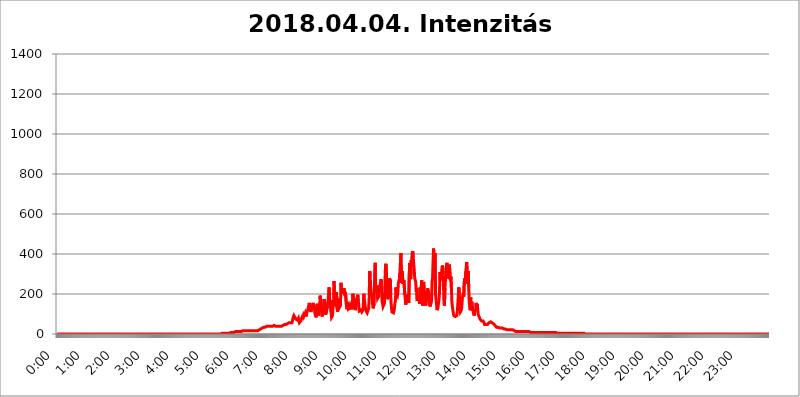
| Category | 2018.04.04. Intenzitás [W/m^2] |
|---|---|
| 0.0 | 0 |
| 0.0006944444444444445 | 0 |
| 0.001388888888888889 | 0 |
| 0.0020833333333333333 | 0 |
| 0.002777777777777778 | 0 |
| 0.003472222222222222 | 0 |
| 0.004166666666666667 | 0 |
| 0.004861111111111111 | 0 |
| 0.005555555555555556 | 0 |
| 0.0062499999999999995 | 0 |
| 0.006944444444444444 | 0 |
| 0.007638888888888889 | 0 |
| 0.008333333333333333 | 0 |
| 0.009027777777777779 | 0 |
| 0.009722222222222222 | 0 |
| 0.010416666666666666 | 0 |
| 0.011111111111111112 | 0 |
| 0.011805555555555555 | 0 |
| 0.012499999999999999 | 0 |
| 0.013194444444444444 | 0 |
| 0.013888888888888888 | 0 |
| 0.014583333333333332 | 0 |
| 0.015277777777777777 | 0 |
| 0.015972222222222224 | 0 |
| 0.016666666666666666 | 0 |
| 0.017361111111111112 | 0 |
| 0.018055555555555557 | 0 |
| 0.01875 | 0 |
| 0.019444444444444445 | 0 |
| 0.02013888888888889 | 0 |
| 0.020833333333333332 | 0 |
| 0.02152777777777778 | 0 |
| 0.022222222222222223 | 0 |
| 0.02291666666666667 | 0 |
| 0.02361111111111111 | 0 |
| 0.024305555555555556 | 0 |
| 0.024999999999999998 | 0 |
| 0.025694444444444447 | 0 |
| 0.02638888888888889 | 0 |
| 0.027083333333333334 | 0 |
| 0.027777777777777776 | 0 |
| 0.02847222222222222 | 0 |
| 0.029166666666666664 | 0 |
| 0.029861111111111113 | 0 |
| 0.030555555555555555 | 0 |
| 0.03125 | 0 |
| 0.03194444444444445 | 0 |
| 0.03263888888888889 | 0 |
| 0.03333333333333333 | 0 |
| 0.034027777777777775 | 0 |
| 0.034722222222222224 | 0 |
| 0.035416666666666666 | 0 |
| 0.036111111111111115 | 0 |
| 0.03680555555555556 | 0 |
| 0.0375 | 0 |
| 0.03819444444444444 | 0 |
| 0.03888888888888889 | 0 |
| 0.03958333333333333 | 0 |
| 0.04027777777777778 | 0 |
| 0.04097222222222222 | 0 |
| 0.041666666666666664 | 0 |
| 0.042361111111111106 | 0 |
| 0.04305555555555556 | 0 |
| 0.043750000000000004 | 0 |
| 0.044444444444444446 | 0 |
| 0.04513888888888889 | 0 |
| 0.04583333333333334 | 0 |
| 0.04652777777777778 | 0 |
| 0.04722222222222222 | 0 |
| 0.04791666666666666 | 0 |
| 0.04861111111111111 | 0 |
| 0.049305555555555554 | 0 |
| 0.049999999999999996 | 0 |
| 0.05069444444444445 | 0 |
| 0.051388888888888894 | 0 |
| 0.052083333333333336 | 0 |
| 0.05277777777777778 | 0 |
| 0.05347222222222222 | 0 |
| 0.05416666666666667 | 0 |
| 0.05486111111111111 | 0 |
| 0.05555555555555555 | 0 |
| 0.05625 | 0 |
| 0.05694444444444444 | 0 |
| 0.057638888888888885 | 0 |
| 0.05833333333333333 | 0 |
| 0.05902777777777778 | 0 |
| 0.059722222222222225 | 0 |
| 0.06041666666666667 | 0 |
| 0.061111111111111116 | 0 |
| 0.06180555555555556 | 0 |
| 0.0625 | 0 |
| 0.06319444444444444 | 0 |
| 0.06388888888888888 | 0 |
| 0.06458333333333334 | 0 |
| 0.06527777777777778 | 0 |
| 0.06597222222222222 | 0 |
| 0.06666666666666667 | 0 |
| 0.06736111111111111 | 0 |
| 0.06805555555555555 | 0 |
| 0.06874999999999999 | 0 |
| 0.06944444444444443 | 0 |
| 0.07013888888888889 | 0 |
| 0.07083333333333333 | 0 |
| 0.07152777777777779 | 0 |
| 0.07222222222222223 | 0 |
| 0.07291666666666667 | 0 |
| 0.07361111111111111 | 0 |
| 0.07430555555555556 | 0 |
| 0.075 | 0 |
| 0.07569444444444444 | 0 |
| 0.0763888888888889 | 0 |
| 0.07708333333333334 | 0 |
| 0.07777777777777778 | 0 |
| 0.07847222222222222 | 0 |
| 0.07916666666666666 | 0 |
| 0.0798611111111111 | 0 |
| 0.08055555555555556 | 0 |
| 0.08125 | 0 |
| 0.08194444444444444 | 0 |
| 0.08263888888888889 | 0 |
| 0.08333333333333333 | 0 |
| 0.08402777777777777 | 0 |
| 0.08472222222222221 | 0 |
| 0.08541666666666665 | 0 |
| 0.08611111111111112 | 0 |
| 0.08680555555555557 | 0 |
| 0.08750000000000001 | 0 |
| 0.08819444444444445 | 0 |
| 0.08888888888888889 | 0 |
| 0.08958333333333333 | 0 |
| 0.09027777777777778 | 0 |
| 0.09097222222222222 | 0 |
| 0.09166666666666667 | 0 |
| 0.09236111111111112 | 0 |
| 0.09305555555555556 | 0 |
| 0.09375 | 0 |
| 0.09444444444444444 | 0 |
| 0.09513888888888888 | 0 |
| 0.09583333333333333 | 0 |
| 0.09652777777777777 | 0 |
| 0.09722222222222222 | 0 |
| 0.09791666666666667 | 0 |
| 0.09861111111111111 | 0 |
| 0.09930555555555555 | 0 |
| 0.09999999999999999 | 0 |
| 0.10069444444444443 | 0 |
| 0.1013888888888889 | 0 |
| 0.10208333333333335 | 0 |
| 0.10277777777777779 | 0 |
| 0.10347222222222223 | 0 |
| 0.10416666666666667 | 0 |
| 0.10486111111111111 | 0 |
| 0.10555555555555556 | 0 |
| 0.10625 | 0 |
| 0.10694444444444444 | 0 |
| 0.1076388888888889 | 0 |
| 0.10833333333333334 | 0 |
| 0.10902777777777778 | 0 |
| 0.10972222222222222 | 0 |
| 0.1111111111111111 | 0 |
| 0.11180555555555556 | 0 |
| 0.11180555555555556 | 0 |
| 0.1125 | 0 |
| 0.11319444444444444 | 0 |
| 0.11388888888888889 | 0 |
| 0.11458333333333333 | 0 |
| 0.11527777777777777 | 0 |
| 0.11597222222222221 | 0 |
| 0.11666666666666665 | 0 |
| 0.1173611111111111 | 0 |
| 0.11805555555555557 | 0 |
| 0.11944444444444445 | 0 |
| 0.12013888888888889 | 0 |
| 0.12083333333333333 | 0 |
| 0.12152777777777778 | 0 |
| 0.12222222222222223 | 0 |
| 0.12291666666666667 | 0 |
| 0.12291666666666667 | 0 |
| 0.12361111111111112 | 0 |
| 0.12430555555555556 | 0 |
| 0.125 | 0 |
| 0.12569444444444444 | 0 |
| 0.12638888888888888 | 0 |
| 0.12708333333333333 | 0 |
| 0.16875 | 0 |
| 0.12847222222222224 | 0 |
| 0.12916666666666668 | 0 |
| 0.12986111111111112 | 0 |
| 0.13055555555555556 | 0 |
| 0.13125 | 0 |
| 0.13194444444444445 | 0 |
| 0.1326388888888889 | 0 |
| 0.13333333333333333 | 0 |
| 0.13402777777777777 | 0 |
| 0.13402777777777777 | 0 |
| 0.13472222222222222 | 0 |
| 0.13541666666666666 | 0 |
| 0.1361111111111111 | 0 |
| 0.13749999999999998 | 0 |
| 0.13819444444444443 | 0 |
| 0.1388888888888889 | 0 |
| 0.13958333333333334 | 0 |
| 0.14027777777777778 | 0 |
| 0.14097222222222222 | 0 |
| 0.14166666666666666 | 0 |
| 0.1423611111111111 | 0 |
| 0.14305555555555557 | 0 |
| 0.14375000000000002 | 0 |
| 0.14444444444444446 | 0 |
| 0.1451388888888889 | 0 |
| 0.1451388888888889 | 0 |
| 0.14652777777777778 | 0 |
| 0.14722222222222223 | 0 |
| 0.14791666666666667 | 0 |
| 0.1486111111111111 | 0 |
| 0.14930555555555555 | 0 |
| 0.15 | 0 |
| 0.15069444444444444 | 0 |
| 0.15138888888888888 | 0 |
| 0.15208333333333332 | 0 |
| 0.15277777777777776 | 0 |
| 0.15347222222222223 | 0 |
| 0.15416666666666667 | 0 |
| 0.15486111111111112 | 0 |
| 0.15555555555555556 | 0 |
| 0.15625 | 0 |
| 0.15694444444444444 | 0 |
| 0.15763888888888888 | 0 |
| 0.15833333333333333 | 0 |
| 0.15902777777777777 | 0 |
| 0.15972222222222224 | 0 |
| 0.16041666666666668 | 0 |
| 0.16111111111111112 | 0 |
| 0.16180555555555556 | 0 |
| 0.1625 | 0 |
| 0.16319444444444445 | 0 |
| 0.1638888888888889 | 0 |
| 0.16458333333333333 | 0 |
| 0.16527777777777777 | 0 |
| 0.16597222222222222 | 0 |
| 0.16666666666666666 | 0 |
| 0.1673611111111111 | 0 |
| 0.16805555555555554 | 0 |
| 0.16874999999999998 | 0 |
| 0.16944444444444443 | 0 |
| 0.17013888888888887 | 0 |
| 0.1708333333333333 | 0 |
| 0.17152777777777775 | 0 |
| 0.17222222222222225 | 0 |
| 0.1729166666666667 | 0 |
| 0.17361111111111113 | 0 |
| 0.17430555555555557 | 0 |
| 0.17500000000000002 | 0 |
| 0.17569444444444446 | 0 |
| 0.1763888888888889 | 0 |
| 0.17708333333333334 | 0 |
| 0.17777777777777778 | 0 |
| 0.17847222222222223 | 0 |
| 0.17916666666666667 | 0 |
| 0.1798611111111111 | 0 |
| 0.18055555555555555 | 0 |
| 0.18125 | 0 |
| 0.18194444444444444 | 0 |
| 0.1826388888888889 | 0 |
| 0.18333333333333335 | 0 |
| 0.1840277777777778 | 0 |
| 0.18472222222222223 | 0 |
| 0.18541666666666667 | 0 |
| 0.18611111111111112 | 0 |
| 0.18680555555555556 | 0 |
| 0.1875 | 0 |
| 0.18819444444444444 | 0 |
| 0.18888888888888888 | 0 |
| 0.18958333333333333 | 0 |
| 0.19027777777777777 | 0 |
| 0.1909722222222222 | 0 |
| 0.19166666666666665 | 0 |
| 0.19236111111111112 | 0 |
| 0.19305555555555554 | 0 |
| 0.19375 | 0 |
| 0.19444444444444445 | 0 |
| 0.1951388888888889 | 0 |
| 0.19583333333333333 | 0 |
| 0.19652777777777777 | 0 |
| 0.19722222222222222 | 0 |
| 0.19791666666666666 | 0 |
| 0.1986111111111111 | 0 |
| 0.19930555555555554 | 0 |
| 0.19999999999999998 | 0 |
| 0.20069444444444443 | 0 |
| 0.20138888888888887 | 0 |
| 0.2020833333333333 | 0 |
| 0.2027777777777778 | 0 |
| 0.2034722222222222 | 0 |
| 0.2041666666666667 | 0 |
| 0.20486111111111113 | 0 |
| 0.20555555555555557 | 0 |
| 0.20625000000000002 | 0 |
| 0.20694444444444446 | 0 |
| 0.2076388888888889 | 0 |
| 0.20833333333333334 | 0 |
| 0.20902777777777778 | 0 |
| 0.20972222222222223 | 0 |
| 0.21041666666666667 | 0 |
| 0.2111111111111111 | 0 |
| 0.21180555555555555 | 0 |
| 0.2125 | 0 |
| 0.21319444444444444 | 0 |
| 0.2138888888888889 | 0 |
| 0.21458333333333335 | 0 |
| 0.2152777777777778 | 0 |
| 0.21597222222222223 | 0 |
| 0.21666666666666667 | 0 |
| 0.21736111111111112 | 0 |
| 0.21805555555555556 | 0 |
| 0.21875 | 0 |
| 0.21944444444444444 | 0 |
| 0.22013888888888888 | 0 |
| 0.22083333333333333 | 0 |
| 0.22152777777777777 | 0 |
| 0.2222222222222222 | 0 |
| 0.22291666666666665 | 0 |
| 0.2236111111111111 | 0 |
| 0.22430555555555556 | 0 |
| 0.225 | 0 |
| 0.22569444444444445 | 0 |
| 0.2263888888888889 | 0 |
| 0.22708333333333333 | 0 |
| 0.22777777777777777 | 0 |
| 0.22847222222222222 | 3.525 |
| 0.22916666666666666 | 0 |
| 0.2298611111111111 | 3.525 |
| 0.23055555555555554 | 3.525 |
| 0.23124999999999998 | 3.525 |
| 0.23194444444444443 | 3.525 |
| 0.23263888888888887 | 3.525 |
| 0.2333333333333333 | 3.525 |
| 0.2340277777777778 | 3.525 |
| 0.2347222222222222 | 3.525 |
| 0.2354166666666667 | 3.525 |
| 0.23611111111111113 | 3.525 |
| 0.23680555555555557 | 3.525 |
| 0.23750000000000002 | 3.525 |
| 0.23819444444444446 | 3.525 |
| 0.2388888888888889 | 3.525 |
| 0.23958333333333334 | 3.525 |
| 0.24027777777777778 | 3.525 |
| 0.24097222222222223 | 3.525 |
| 0.24166666666666667 | 3.525 |
| 0.2423611111111111 | 3.525 |
| 0.24305555555555555 | 3.525 |
| 0.24375 | 7.887 |
| 0.24444444444444446 | 7.887 |
| 0.24513888888888888 | 7.887 |
| 0.24583333333333335 | 7.887 |
| 0.2465277777777778 | 7.887 |
| 0.24722222222222223 | 7.887 |
| 0.24791666666666667 | 7.887 |
| 0.24861111111111112 | 7.887 |
| 0.24930555555555556 | 7.887 |
| 0.25 | 12.257 |
| 0.25069444444444444 | 12.257 |
| 0.2513888888888889 | 12.257 |
| 0.2520833333333333 | 12.257 |
| 0.25277777777777777 | 12.257 |
| 0.2534722222222222 | 12.257 |
| 0.25416666666666665 | 12.257 |
| 0.2548611111111111 | 12.257 |
| 0.2555555555555556 | 12.257 |
| 0.25625000000000003 | 12.257 |
| 0.2569444444444445 | 12.257 |
| 0.2576388888888889 | 12.257 |
| 0.25833333333333336 | 12.257 |
| 0.2590277777777778 | 16.636 |
| 0.25972222222222224 | 12.257 |
| 0.2604166666666667 | 16.636 |
| 0.2611111111111111 | 16.636 |
| 0.26180555555555557 | 16.636 |
| 0.2625 | 16.636 |
| 0.26319444444444445 | 16.636 |
| 0.2638888888888889 | 16.636 |
| 0.26458333333333334 | 16.636 |
| 0.2652777777777778 | 16.636 |
| 0.2659722222222222 | 16.636 |
| 0.26666666666666666 | 16.636 |
| 0.2673611111111111 | 16.636 |
| 0.26805555555555555 | 16.636 |
| 0.26875 | 16.636 |
| 0.26944444444444443 | 16.636 |
| 0.2701388888888889 | 16.636 |
| 0.2708333333333333 | 16.636 |
| 0.27152777777777776 | 16.636 |
| 0.2722222222222222 | 16.636 |
| 0.27291666666666664 | 16.636 |
| 0.2736111111111111 | 16.636 |
| 0.2743055555555555 | 16.636 |
| 0.27499999999999997 | 16.636 |
| 0.27569444444444446 | 16.636 |
| 0.27638888888888885 | 16.636 |
| 0.27708333333333335 | 16.636 |
| 0.2777777777777778 | 12.257 |
| 0.27847222222222223 | 16.636 |
| 0.2791666666666667 | 16.636 |
| 0.2798611111111111 | 16.636 |
| 0.28055555555555556 | 16.636 |
| 0.28125 | 16.636 |
| 0.28194444444444444 | 21.024 |
| 0.2826388888888889 | 21.024 |
| 0.2833333333333333 | 21.024 |
| 0.28402777777777777 | 21.024 |
| 0.2847222222222222 | 25.419 |
| 0.28541666666666665 | 25.419 |
| 0.28611111111111115 | 25.419 |
| 0.28680555555555554 | 25.419 |
| 0.28750000000000003 | 29.823 |
| 0.2881944444444445 | 29.823 |
| 0.2888888888888889 | 29.823 |
| 0.28958333333333336 | 34.234 |
| 0.2902777777777778 | 34.234 |
| 0.29097222222222224 | 34.234 |
| 0.2916666666666667 | 34.234 |
| 0.2923611111111111 | 34.234 |
| 0.29305555555555557 | 38.653 |
| 0.29375 | 38.653 |
| 0.29444444444444445 | 43.079 |
| 0.2951388888888889 | 38.653 |
| 0.29583333333333334 | 38.653 |
| 0.2965277777777778 | 38.653 |
| 0.2972222222222222 | 38.653 |
| 0.29791666666666666 | 38.653 |
| 0.2986111111111111 | 38.653 |
| 0.29930555555555555 | 38.653 |
| 0.3 | 38.653 |
| 0.30069444444444443 | 38.653 |
| 0.3013888888888889 | 38.653 |
| 0.3020833333333333 | 38.653 |
| 0.30277777777777776 | 43.079 |
| 0.3034722222222222 | 43.079 |
| 0.30416666666666664 | 43.079 |
| 0.3048611111111111 | 43.079 |
| 0.3055555555555555 | 43.079 |
| 0.30624999999999997 | 38.653 |
| 0.3069444444444444 | 38.653 |
| 0.3076388888888889 | 38.653 |
| 0.30833333333333335 | 38.653 |
| 0.3090277777777778 | 38.653 |
| 0.30972222222222223 | 38.653 |
| 0.3104166666666667 | 38.653 |
| 0.3111111111111111 | 38.653 |
| 0.31180555555555556 | 38.653 |
| 0.3125 | 38.653 |
| 0.31319444444444444 | 38.653 |
| 0.3138888888888889 | 38.653 |
| 0.3145833333333333 | 38.653 |
| 0.31527777777777777 | 38.653 |
| 0.3159722222222222 | 43.079 |
| 0.31666666666666665 | 43.079 |
| 0.31736111111111115 | 43.079 |
| 0.31805555555555554 | 47.511 |
| 0.31875000000000003 | 47.511 |
| 0.3194444444444445 | 47.511 |
| 0.3201388888888889 | 47.511 |
| 0.32083333333333336 | 47.511 |
| 0.3215277777777778 | 47.511 |
| 0.32222222222222224 | 51.951 |
| 0.3229166666666667 | 51.951 |
| 0.3236111111111111 | 51.951 |
| 0.32430555555555557 | 56.398 |
| 0.325 | 56.398 |
| 0.32569444444444445 | 51.951 |
| 0.3263888888888889 | 56.398 |
| 0.32708333333333334 | 56.398 |
| 0.3277777777777778 | 51.951 |
| 0.3284722222222222 | 51.951 |
| 0.32916666666666666 | 56.398 |
| 0.3298611111111111 | 65.31 |
| 0.33055555555555555 | 78.722 |
| 0.33125 | 83.205 |
| 0.33194444444444443 | 92.184 |
| 0.3326388888888889 | 87.692 |
| 0.3333333333333333 | 83.205 |
| 0.3340277777777778 | 83.205 |
| 0.3347222222222222 | 74.246 |
| 0.3354166666666667 | 69.775 |
| 0.3361111111111111 | 69.775 |
| 0.3368055555555556 | 69.775 |
| 0.33749999999999997 | 74.246 |
| 0.33819444444444446 | 78.722 |
| 0.33888888888888885 | 65.31 |
| 0.33958333333333335 | 56.398 |
| 0.34027777777777773 | 56.398 |
| 0.34097222222222223 | 60.85 |
| 0.3416666666666666 | 65.31 |
| 0.3423611111111111 | 74.246 |
| 0.3430555555555555 | 78.722 |
| 0.34375 | 87.692 |
| 0.3444444444444445 | 87.692 |
| 0.3451388888888889 | 96.682 |
| 0.3458333333333334 | 87.692 |
| 0.34652777777777777 | 87.692 |
| 0.34722222222222227 | 87.692 |
| 0.34791666666666665 | 105.69 |
| 0.34861111111111115 | 96.682 |
| 0.34930555555555554 | 87.692 |
| 0.35000000000000003 | 110.201 |
| 0.3506944444444444 | 105.69 |
| 0.3513888888888889 | 119.235 |
| 0.3520833333333333 | 123.758 |
| 0.3527777777777778 | 123.758 |
| 0.3534722222222222 | 155.509 |
| 0.3541666666666667 | 160.056 |
| 0.3548611111111111 | 150.964 |
| 0.35555555555555557 | 110.201 |
| 0.35625 | 119.235 |
| 0.35694444444444445 | 141.884 |
| 0.3576388888888889 | 128.284 |
| 0.35833333333333334 | 132.814 |
| 0.3590277777777778 | 155.509 |
| 0.3597222222222222 | 119.235 |
| 0.36041666666666666 | 119.235 |
| 0.3611111111111111 | 137.347 |
| 0.36180555555555555 | 96.682 |
| 0.3625 | 92.184 |
| 0.36319444444444443 | 83.205 |
| 0.3638888888888889 | 87.692 |
| 0.3645833333333333 | 150.964 |
| 0.3652777777777778 | 114.716 |
| 0.3659722222222222 | 101.184 |
| 0.3666666666666667 | 92.184 |
| 0.3673611111111111 | 114.716 |
| 0.3680555555555556 | 137.347 |
| 0.36874999999999997 | 191.937 |
| 0.36944444444444446 | 150.964 |
| 0.37013888888888885 | 155.509 |
| 0.37083333333333335 | 110.201 |
| 0.37152777777777773 | 87.692 |
| 0.37222222222222223 | 110.201 |
| 0.3729166666666666 | 137.347 |
| 0.3736111111111111 | 123.758 |
| 0.3743055555555555 | 173.709 |
| 0.375 | 128.284 |
| 0.3756944444444445 | 128.284 |
| 0.3763888888888889 | 96.682 |
| 0.3770833333333334 | 101.184 |
| 0.37777777777777777 | 114.716 |
| 0.37847222222222227 | 128.284 |
| 0.37916666666666665 | 155.509 |
| 0.37986111111111115 | 169.156 |
| 0.38055555555555554 | 201.058 |
| 0.38125000000000003 | 233 |
| 0.3819444444444444 | 187.378 |
| 0.3826388888888889 | 128.284 |
| 0.3833333333333333 | 169.156 |
| 0.3840277777777778 | 110.201 |
| 0.3847222222222222 | 83.205 |
| 0.3854166666666667 | 83.205 |
| 0.3861111111111111 | 92.184 |
| 0.38680555555555557 | 137.347 |
| 0.3875 | 150.964 |
| 0.38819444444444445 | 264.932 |
| 0.3888888888888889 | 150.964 |
| 0.38958333333333334 | 173.709 |
| 0.3902777777777778 | 155.509 |
| 0.3909722222222222 | 137.347 |
| 0.39166666666666666 | 210.182 |
| 0.3923611111111111 | 128.284 |
| 0.39305555555555555 | 110.201 |
| 0.39375 | 132.814 |
| 0.39444444444444443 | 178.264 |
| 0.3951388888888889 | 173.709 |
| 0.3958333333333333 | 132.814 |
| 0.3965277777777778 | 132.814 |
| 0.3972222222222222 | 141.884 |
| 0.3979166666666667 | 255.813 |
| 0.3986111111111111 | 219.309 |
| 0.3993055555555556 | 210.182 |
| 0.39999999999999997 | 201.058 |
| 0.40069444444444446 | 228.436 |
| 0.40138888888888885 | 205.62 |
| 0.40208333333333335 | 228.436 |
| 0.40277777777777773 | 210.182 |
| 0.40347222222222223 | 191.937 |
| 0.4041666666666666 | 210.182 |
| 0.4048611111111111 | 214.746 |
| 0.4055555555555555 | 146.423 |
| 0.40625 | 123.758 |
| 0.4069444444444445 | 160.056 |
| 0.4076388888888889 | 150.964 |
| 0.4083333333333334 | 123.758 |
| 0.40902777777777777 | 123.758 |
| 0.40972222222222227 | 119.235 |
| 0.41041666666666665 | 128.284 |
| 0.41111111111111115 | 141.884 |
| 0.41180555555555554 | 146.423 |
| 0.41250000000000003 | 128.284 |
| 0.4131944444444444 | 146.423 |
| 0.4138888888888889 | 123.758 |
| 0.4145833333333333 | 201.058 |
| 0.4152777777777778 | 191.937 |
| 0.4159722222222222 | 146.423 |
| 0.4166666666666667 | 178.264 |
| 0.4173611111111111 | 132.814 |
| 0.41805555555555557 | 119.235 |
| 0.41875 | 128.284 |
| 0.41944444444444445 | 150.964 |
| 0.4201388888888889 | 141.884 |
| 0.42083333333333334 | 187.378 |
| 0.4215277777777778 | 196.497 |
| 0.4222222222222222 | 164.605 |
| 0.42291666666666666 | 141.884 |
| 0.4236111111111111 | 114.716 |
| 0.42430555555555555 | 110.201 |
| 0.425 | 119.235 |
| 0.42569444444444443 | 119.235 |
| 0.4263888888888889 | 114.716 |
| 0.4270833333333333 | 110.201 |
| 0.4277777777777778 | 110.201 |
| 0.4284722222222222 | 119.235 |
| 0.4291666666666667 | 137.347 |
| 0.4298611111111111 | 201.058 |
| 0.4305555555555556 | 182.82 |
| 0.43124999999999997 | 182.82 |
| 0.43194444444444446 | 137.347 |
| 0.43263888888888885 | 119.235 |
| 0.43333333333333335 | 114.716 |
| 0.43402777777777773 | 114.716 |
| 0.43472222222222223 | 105.69 |
| 0.4354166666666666 | 101.184 |
| 0.4361111111111111 | 105.69 |
| 0.4368055555555555 | 128.284 |
| 0.4375 | 182.82 |
| 0.4381944444444445 | 314.98 |
| 0.4388888888888889 | 292.259 |
| 0.4395833333333334 | 233 |
| 0.44027777777777777 | 233 |
| 0.44097222222222227 | 237.564 |
| 0.44166666666666665 | 173.709 |
| 0.44236111111111115 | 146.423 |
| 0.44305555555555554 | 128.284 |
| 0.44375000000000003 | 132.814 |
| 0.4444444444444444 | 150.964 |
| 0.4451388888888889 | 287.709 |
| 0.4458333333333333 | 355.712 |
| 0.4465277777777778 | 219.309 |
| 0.4472222222222222 | 237.564 |
| 0.4479166666666667 | 205.62 |
| 0.4486111111111111 | 242.127 |
| 0.44930555555555557 | 178.264 |
| 0.45 | 182.82 |
| 0.45069444444444445 | 187.378 |
| 0.4513888888888889 | 223.873 |
| 0.45208333333333334 | 233 |
| 0.4527777777777778 | 228.436 |
| 0.4534722222222222 | 255.813 |
| 0.45416666666666666 | 274.047 |
| 0.4548611111111111 | 214.746 |
| 0.45555555555555555 | 164.605 |
| 0.45625 | 150.964 |
| 0.45694444444444443 | 137.347 |
| 0.4576388888888889 | 132.814 |
| 0.4583333333333333 | 137.347 |
| 0.4590277777777778 | 155.509 |
| 0.4597222222222222 | 274.047 |
| 0.4604166666666667 | 342.162 |
| 0.4611111111111111 | 351.198 |
| 0.4618055555555556 | 287.709 |
| 0.46249999999999997 | 255.813 |
| 0.46319444444444446 | 191.937 |
| 0.46388888888888885 | 173.709 |
| 0.46458333333333335 | 178.264 |
| 0.46527777777777773 | 260.373 |
| 0.46597222222222223 | 278.603 |
| 0.4666666666666666 | 278.603 |
| 0.4673611111111111 | 264.932 |
| 0.4680555555555555 | 160.056 |
| 0.46875 | 132.814 |
| 0.4694444444444445 | 110.201 |
| 0.4701388888888889 | 105.69 |
| 0.4708333333333334 | 105.69 |
| 0.47152777777777777 | 105.69 |
| 0.47222222222222227 | 114.716 |
| 0.47291666666666665 | 128.284 |
| 0.47361111111111115 | 155.509 |
| 0.47430555555555554 | 164.605 |
| 0.47500000000000003 | 233 |
| 0.4756944444444444 | 201.058 |
| 0.4763888888888889 | 201.058 |
| 0.4770833333333333 | 191.937 |
| 0.4777777777777778 | 210.182 |
| 0.4784722222222222 | 255.813 |
| 0.4791666666666667 | 264.932 |
| 0.4798611111111111 | 255.813 |
| 0.48055555555555557 | 305.898 |
| 0.48125 | 301.354 |
| 0.48194444444444445 | 405.108 |
| 0.4826388888888889 | 292.259 |
| 0.48333333333333334 | 269.49 |
| 0.4840277777777778 | 314.98 |
| 0.4847222222222222 | 251.251 |
| 0.48541666666666666 | 251.251 |
| 0.4861111111111111 | 269.49 |
| 0.48680555555555555 | 269.49 |
| 0.4875 | 196.497 |
| 0.48819444444444443 | 173.709 |
| 0.4888888888888889 | 146.423 |
| 0.4895833333333333 | 196.497 |
| 0.4902777777777778 | 201.058 |
| 0.4909722222222222 | 169.156 |
| 0.4916666666666667 | 182.82 |
| 0.4923611111111111 | 164.605 |
| 0.4930555555555556 | 155.509 |
| 0.49374999999999997 | 305.898 |
| 0.49444444444444446 | 355.712 |
| 0.49513888888888885 | 301.354 |
| 0.49583333333333335 | 274.047 |
| 0.49652777777777773 | 369.23 |
| 0.49722222222222223 | 337.639 |
| 0.4979166666666666 | 405.108 |
| 0.4986111111111111 | 414.035 |
| 0.4993055555555555 | 382.715 |
| 0.5 | 378.224 |
| 0.5006944444444444 | 319.517 |
| 0.5013888888888889 | 278.603 |
| 0.5020833333333333 | 269.49 |
| 0.5027777777777778 | 260.373 |
| 0.5034722222222222 | 210.182 |
| 0.5041666666666667 | 228.436 |
| 0.5048611111111111 | 164.605 |
| 0.5055555555555555 | 173.709 |
| 0.50625 | 173.709 |
| 0.5069444444444444 | 191.937 |
| 0.5076388888888889 | 169.156 |
| 0.5083333333333333 | 150.964 |
| 0.5090277777777777 | 233 |
| 0.5097222222222222 | 214.746 |
| 0.5104166666666666 | 228.436 |
| 0.5111111111111112 | 269.49 |
| 0.5118055555555555 | 191.937 |
| 0.5125000000000001 | 141.884 |
| 0.5131944444444444 | 182.82 |
| 0.513888888888889 | 260.373 |
| 0.5145833333333333 | 223.873 |
| 0.5152777777777778 | 205.62 |
| 0.5159722222222222 | 150.964 |
| 0.5166666666666667 | 141.884 |
| 0.517361111111111 | 155.509 |
| 0.5180555555555556 | 169.156 |
| 0.5187499999999999 | 182.82 |
| 0.5194444444444445 | 228.436 |
| 0.5201388888888888 | 228.436 |
| 0.5208333333333334 | 205.62 |
| 0.5215277777777778 | 196.497 |
| 0.5222222222222223 | 146.423 |
| 0.5229166666666667 | 137.347 |
| 0.5236111111111111 | 132.814 |
| 0.5243055555555556 | 137.347 |
| 0.525 | 169.156 |
| 0.5256944444444445 | 260.373 |
| 0.5263888888888889 | 278.603 |
| 0.5270833333333333 | 364.728 |
| 0.5277777777777778 | 427.39 |
| 0.5284722222222222 | 387.202 |
| 0.5291666666666667 | 364.728 |
| 0.5298611111111111 | 405.108 |
| 0.5305555555555556 | 196.497 |
| 0.53125 | 173.709 |
| 0.5319444444444444 | 169.156 |
| 0.5326388888888889 | 119.235 |
| 0.5333333333333333 | 114.716 |
| 0.5340277777777778 | 132.814 |
| 0.5347222222222222 | 155.509 |
| 0.5354166666666667 | 169.156 |
| 0.5361111111111111 | 210.182 |
| 0.5368055555555555 | 310.44 |
| 0.5375 | 269.49 |
| 0.5381944444444444 | 269.49 |
| 0.5388888888888889 | 292.259 |
| 0.5395833333333333 | 333.113 |
| 0.5402777777777777 | 342.162 |
| 0.5409722222222222 | 310.44 |
| 0.5416666666666666 | 251.251 |
| 0.5423611111111112 | 155.509 |
| 0.5430555555555555 | 141.884 |
| 0.5437500000000001 | 228.436 |
| 0.5444444444444444 | 269.49 |
| 0.545138888888889 | 314.98 |
| 0.5458333333333333 | 342.162 |
| 0.5465277777777778 | 355.712 |
| 0.5472222222222222 | 278.603 |
| 0.5479166666666667 | 278.603 |
| 0.548611111111111 | 314.98 |
| 0.5493055555555556 | 278.603 |
| 0.5499999999999999 | 346.682 |
| 0.5506944444444445 | 342.162 |
| 0.5513888888888888 | 269.49 |
| 0.5520833333333334 | 287.709 |
| 0.5527777777777778 | 233 |
| 0.5534722222222223 | 164.605 |
| 0.5541666666666667 | 137.347 |
| 0.5548611111111111 | 119.235 |
| 0.5555555555555556 | 119.235 |
| 0.55625 | 92.184 |
| 0.5569444444444445 | 92.184 |
| 0.5576388888888889 | 87.692 |
| 0.5583333333333333 | 87.692 |
| 0.5590277777777778 | 83.205 |
| 0.5597222222222222 | 87.692 |
| 0.5604166666666667 | 92.184 |
| 0.5611111111111111 | 110.201 |
| 0.5618055555555556 | 150.964 |
| 0.5625 | 191.937 |
| 0.5631944444444444 | 233 |
| 0.5638888888888889 | 205.62 |
| 0.5645833333333333 | 128.284 |
| 0.5652777777777778 | 110.201 |
| 0.5659722222222222 | 110.201 |
| 0.5666666666666667 | 119.235 |
| 0.5673611111111111 | 137.347 |
| 0.5680555555555555 | 173.709 |
| 0.56875 | 191.937 |
| 0.5694444444444444 | 205.62 |
| 0.5701388888888889 | 187.378 |
| 0.5708333333333333 | 260.373 |
| 0.5715277777777777 | 278.603 |
| 0.5722222222222222 | 260.373 |
| 0.5729166666666666 | 310.44 |
| 0.5736111111111112 | 310.44 |
| 0.5743055555555555 | 360.221 |
| 0.5750000000000001 | 292.259 |
| 0.5756944444444444 | 251.251 |
| 0.576388888888889 | 314.98 |
| 0.5770833333333333 | 237.564 |
| 0.5777777777777778 | 160.056 |
| 0.5784722222222222 | 141.884 |
| 0.5791666666666667 | 119.235 |
| 0.579861111111111 | 182.82 |
| 0.5805555555555556 | 119.235 |
| 0.5812499999999999 | 160.056 |
| 0.5819444444444445 | 150.964 |
| 0.5826388888888888 | 123.758 |
| 0.5833333333333334 | 128.284 |
| 0.5840277777777778 | 101.184 |
| 0.5847222222222223 | 92.184 |
| 0.5854166666666667 | 105.69 |
| 0.5861111111111111 | 110.201 |
| 0.5868055555555556 | 123.758 |
| 0.5875 | 155.509 |
| 0.5881944444444445 | 128.284 |
| 0.5888888888888889 | 150.964 |
| 0.5895833333333333 | 128.284 |
| 0.5902777777777778 | 101.184 |
| 0.5909722222222222 | 92.184 |
| 0.5916666666666667 | 92.184 |
| 0.5923611111111111 | 92.184 |
| 0.5930555555555556 | 74.246 |
| 0.59375 | 74.246 |
| 0.5944444444444444 | 69.775 |
| 0.5951388888888889 | 65.31 |
| 0.5958333333333333 | 60.85 |
| 0.5965277777777778 | 60.85 |
| 0.5972222222222222 | 65.31 |
| 0.5979166666666667 | 60.85 |
| 0.5986111111111111 | 56.398 |
| 0.5993055555555555 | 47.511 |
| 0.6 | 47.511 |
| 0.6006944444444444 | 47.511 |
| 0.6013888888888889 | 47.511 |
| 0.6020833333333333 | 47.511 |
| 0.6027777777777777 | 47.511 |
| 0.6034722222222222 | 47.511 |
| 0.6041666666666666 | 47.511 |
| 0.6048611111111112 | 47.511 |
| 0.6055555555555555 | 56.398 |
| 0.6062500000000001 | 56.398 |
| 0.6069444444444444 | 60.85 |
| 0.607638888888889 | 60.85 |
| 0.6083333333333333 | 56.398 |
| 0.6090277777777778 | 56.398 |
| 0.6097222222222222 | 56.398 |
| 0.6104166666666667 | 56.398 |
| 0.611111111111111 | 51.951 |
| 0.6118055555555556 | 51.951 |
| 0.6124999999999999 | 51.951 |
| 0.6131944444444445 | 47.511 |
| 0.6138888888888888 | 43.079 |
| 0.6145833333333334 | 38.653 |
| 0.6152777777777778 | 38.653 |
| 0.6159722222222223 | 34.234 |
| 0.6166666666666667 | 34.234 |
| 0.6173611111111111 | 34.234 |
| 0.6180555555555556 | 34.234 |
| 0.61875 | 29.823 |
| 0.6194444444444445 | 29.823 |
| 0.6201388888888889 | 29.823 |
| 0.6208333333333333 | 29.823 |
| 0.6215277777777778 | 29.823 |
| 0.6222222222222222 | 29.823 |
| 0.6229166666666667 | 29.823 |
| 0.6236111111111111 | 29.823 |
| 0.6243055555555556 | 29.823 |
| 0.625 | 29.823 |
| 0.6256944444444444 | 29.823 |
| 0.6263888888888889 | 25.419 |
| 0.6270833333333333 | 25.419 |
| 0.6277777777777778 | 25.419 |
| 0.6284722222222222 | 25.419 |
| 0.6291666666666667 | 21.024 |
| 0.6298611111111111 | 21.024 |
| 0.6305555555555555 | 21.024 |
| 0.63125 | 21.024 |
| 0.6319444444444444 | 21.024 |
| 0.6326388888888889 | 21.024 |
| 0.6333333333333333 | 21.024 |
| 0.6340277777777777 | 21.024 |
| 0.6347222222222222 | 21.024 |
| 0.6354166666666666 | 21.024 |
| 0.6361111111111112 | 21.024 |
| 0.6368055555555555 | 21.024 |
| 0.6375000000000001 | 21.024 |
| 0.6381944444444444 | 21.024 |
| 0.638888888888889 | 21.024 |
| 0.6395833333333333 | 21.024 |
| 0.6402777777777778 | 16.636 |
| 0.6409722222222222 | 16.636 |
| 0.6416666666666667 | 16.636 |
| 0.642361111111111 | 16.636 |
| 0.6430555555555556 | 12.257 |
| 0.6437499999999999 | 12.257 |
| 0.6444444444444445 | 12.257 |
| 0.6451388888888888 | 12.257 |
| 0.6458333333333334 | 12.257 |
| 0.6465277777777778 | 12.257 |
| 0.6472222222222223 | 12.257 |
| 0.6479166666666667 | 12.257 |
| 0.6486111111111111 | 12.257 |
| 0.6493055555555556 | 12.257 |
| 0.65 | 12.257 |
| 0.6506944444444445 | 12.257 |
| 0.6513888888888889 | 12.257 |
| 0.6520833333333333 | 12.257 |
| 0.6527777777777778 | 12.257 |
| 0.6534722222222222 | 12.257 |
| 0.6541666666666667 | 12.257 |
| 0.6548611111111111 | 12.257 |
| 0.6555555555555556 | 12.257 |
| 0.65625 | 12.257 |
| 0.6569444444444444 | 12.257 |
| 0.6576388888888889 | 12.257 |
| 0.6583333333333333 | 12.257 |
| 0.6590277777777778 | 12.257 |
| 0.6597222222222222 | 12.257 |
| 0.6604166666666667 | 12.257 |
| 0.6611111111111111 | 12.257 |
| 0.6618055555555555 | 12.257 |
| 0.6625 | 12.257 |
| 0.6631944444444444 | 12.257 |
| 0.6638888888888889 | 7.887 |
| 0.6645833333333333 | 7.887 |
| 0.6652777777777777 | 7.887 |
| 0.6659722222222222 | 7.887 |
| 0.6666666666666666 | 7.887 |
| 0.6673611111111111 | 7.887 |
| 0.6680555555555556 | 7.887 |
| 0.6687500000000001 | 7.887 |
| 0.6694444444444444 | 7.887 |
| 0.6701388888888888 | 7.887 |
| 0.6708333333333334 | 7.887 |
| 0.6715277777777778 | 7.887 |
| 0.6722222222222222 | 7.887 |
| 0.6729166666666666 | 7.887 |
| 0.6736111111111112 | 7.887 |
| 0.6743055555555556 | 7.887 |
| 0.6749999999999999 | 7.887 |
| 0.6756944444444444 | 7.887 |
| 0.6763888888888889 | 7.887 |
| 0.6770833333333334 | 7.887 |
| 0.6777777777777777 | 7.887 |
| 0.6784722222222223 | 7.887 |
| 0.6791666666666667 | 7.887 |
| 0.6798611111111111 | 7.887 |
| 0.6805555555555555 | 7.887 |
| 0.68125 | 7.887 |
| 0.6819444444444445 | 7.887 |
| 0.6826388888888889 | 7.887 |
| 0.6833333333333332 | 7.887 |
| 0.6840277777777778 | 7.887 |
| 0.6847222222222222 | 7.887 |
| 0.6854166666666667 | 7.887 |
| 0.686111111111111 | 7.887 |
| 0.6868055555555556 | 7.887 |
| 0.6875 | 7.887 |
| 0.6881944444444444 | 7.887 |
| 0.688888888888889 | 7.887 |
| 0.6895833333333333 | 7.887 |
| 0.6902777777777778 | 7.887 |
| 0.6909722222222222 | 7.887 |
| 0.6916666666666668 | 7.887 |
| 0.6923611111111111 | 7.887 |
| 0.6930555555555555 | 7.887 |
| 0.69375 | 7.887 |
| 0.6944444444444445 | 7.887 |
| 0.6951388888888889 | 7.887 |
| 0.6958333333333333 | 7.887 |
| 0.6965277777777777 | 7.887 |
| 0.6972222222222223 | 7.887 |
| 0.6979166666666666 | 7.887 |
| 0.6986111111111111 | 7.887 |
| 0.6993055555555556 | 7.887 |
| 0.7000000000000001 | 7.887 |
| 0.7006944444444444 | 7.887 |
| 0.7013888888888888 | 3.525 |
| 0.7020833333333334 | 3.525 |
| 0.7027777777777778 | 3.525 |
| 0.7034722222222222 | 3.525 |
| 0.7041666666666666 | 3.525 |
| 0.7048611111111112 | 3.525 |
| 0.7055555555555556 | 3.525 |
| 0.7062499999999999 | 3.525 |
| 0.7069444444444444 | 3.525 |
| 0.7076388888888889 | 3.525 |
| 0.7083333333333334 | 3.525 |
| 0.7090277777777777 | 3.525 |
| 0.7097222222222223 | 3.525 |
| 0.7104166666666667 | 3.525 |
| 0.7111111111111111 | 3.525 |
| 0.7118055555555555 | 3.525 |
| 0.7125 | 3.525 |
| 0.7131944444444445 | 3.525 |
| 0.7138888888888889 | 3.525 |
| 0.7145833333333332 | 3.525 |
| 0.7152777777777778 | 3.525 |
| 0.7159722222222222 | 3.525 |
| 0.7166666666666667 | 3.525 |
| 0.717361111111111 | 3.525 |
| 0.7180555555555556 | 3.525 |
| 0.71875 | 3.525 |
| 0.7194444444444444 | 3.525 |
| 0.720138888888889 | 3.525 |
| 0.7208333333333333 | 3.525 |
| 0.7215277777777778 | 3.525 |
| 0.7222222222222222 | 3.525 |
| 0.7229166666666668 | 3.525 |
| 0.7236111111111111 | 3.525 |
| 0.7243055555555555 | 3.525 |
| 0.725 | 3.525 |
| 0.7256944444444445 | 3.525 |
| 0.7263888888888889 | 3.525 |
| 0.7270833333333333 | 3.525 |
| 0.7277777777777777 | 3.525 |
| 0.7284722222222223 | 3.525 |
| 0.7291666666666666 | 3.525 |
| 0.7298611111111111 | 3.525 |
| 0.7305555555555556 | 3.525 |
| 0.7312500000000001 | 3.525 |
| 0.7319444444444444 | 3.525 |
| 0.7326388888888888 | 3.525 |
| 0.7333333333333334 | 3.525 |
| 0.7340277777777778 | 3.525 |
| 0.7347222222222222 | 3.525 |
| 0.7354166666666666 | 3.525 |
| 0.7361111111111112 | 3.525 |
| 0.7368055555555556 | 3.525 |
| 0.7374999999999999 | 3.525 |
| 0.7381944444444444 | 3.525 |
| 0.7388888888888889 | 3.525 |
| 0.7395833333333334 | 0 |
| 0.7402777777777777 | 0 |
| 0.7409722222222223 | 0 |
| 0.7416666666666667 | 0 |
| 0.7423611111111111 | 0 |
| 0.7430555555555555 | 0 |
| 0.74375 | 0 |
| 0.7444444444444445 | 0 |
| 0.7451388888888889 | 0 |
| 0.7458333333333332 | 0 |
| 0.7465277777777778 | 0 |
| 0.7472222222222222 | 0 |
| 0.7479166666666667 | 0 |
| 0.748611111111111 | 0 |
| 0.7493055555555556 | 0 |
| 0.75 | 0 |
| 0.7506944444444444 | 0 |
| 0.751388888888889 | 0 |
| 0.7520833333333333 | 0 |
| 0.7527777777777778 | 0 |
| 0.7534722222222222 | 0 |
| 0.7541666666666668 | 0 |
| 0.7548611111111111 | 0 |
| 0.7555555555555555 | 0 |
| 0.75625 | 0 |
| 0.7569444444444445 | 0 |
| 0.7576388888888889 | 0 |
| 0.7583333333333333 | 0 |
| 0.7590277777777777 | 0 |
| 0.7597222222222223 | 0 |
| 0.7604166666666666 | 0 |
| 0.7611111111111111 | 0 |
| 0.7618055555555556 | 0 |
| 0.7625000000000001 | 0 |
| 0.7631944444444444 | 0 |
| 0.7638888888888888 | 0 |
| 0.7645833333333334 | 0 |
| 0.7652777777777778 | 0 |
| 0.7659722222222222 | 0 |
| 0.7666666666666666 | 0 |
| 0.7673611111111112 | 0 |
| 0.7680555555555556 | 0 |
| 0.7687499999999999 | 0 |
| 0.7694444444444444 | 0 |
| 0.7701388888888889 | 0 |
| 0.7708333333333334 | 0 |
| 0.7715277777777777 | 0 |
| 0.7722222222222223 | 0 |
| 0.7729166666666667 | 0 |
| 0.7736111111111111 | 0 |
| 0.7743055555555555 | 0 |
| 0.775 | 0 |
| 0.7756944444444445 | 0 |
| 0.7763888888888889 | 0 |
| 0.7770833333333332 | 0 |
| 0.7777777777777778 | 0 |
| 0.7784722222222222 | 0 |
| 0.7791666666666667 | 0 |
| 0.779861111111111 | 0 |
| 0.7805555555555556 | 0 |
| 0.78125 | 0 |
| 0.7819444444444444 | 0 |
| 0.782638888888889 | 0 |
| 0.7833333333333333 | 0 |
| 0.7840277777777778 | 0 |
| 0.7847222222222222 | 0 |
| 0.7854166666666668 | 0 |
| 0.7861111111111111 | 0 |
| 0.7868055555555555 | 0 |
| 0.7875 | 0 |
| 0.7881944444444445 | 0 |
| 0.7888888888888889 | 0 |
| 0.7895833333333333 | 0 |
| 0.7902777777777777 | 0 |
| 0.7909722222222223 | 0 |
| 0.7916666666666666 | 0 |
| 0.7923611111111111 | 0 |
| 0.7930555555555556 | 0 |
| 0.7937500000000001 | 0 |
| 0.7944444444444444 | 0 |
| 0.7951388888888888 | 0 |
| 0.7958333333333334 | 0 |
| 0.7965277777777778 | 0 |
| 0.7972222222222222 | 0 |
| 0.7979166666666666 | 0 |
| 0.7986111111111112 | 0 |
| 0.7993055555555556 | 0 |
| 0.7999999999999999 | 0 |
| 0.8006944444444444 | 0 |
| 0.8013888888888889 | 0 |
| 0.8020833333333334 | 0 |
| 0.8027777777777777 | 0 |
| 0.8034722222222223 | 0 |
| 0.8041666666666667 | 0 |
| 0.8048611111111111 | 0 |
| 0.8055555555555555 | 0 |
| 0.80625 | 0 |
| 0.8069444444444445 | 0 |
| 0.8076388888888889 | 0 |
| 0.8083333333333332 | 0 |
| 0.8090277777777778 | 0 |
| 0.8097222222222222 | 0 |
| 0.8104166666666667 | 0 |
| 0.811111111111111 | 0 |
| 0.8118055555555556 | 0 |
| 0.8125 | 0 |
| 0.8131944444444444 | 0 |
| 0.813888888888889 | 0 |
| 0.8145833333333333 | 0 |
| 0.8152777777777778 | 0 |
| 0.8159722222222222 | 0 |
| 0.8166666666666668 | 0 |
| 0.8173611111111111 | 0 |
| 0.8180555555555555 | 0 |
| 0.81875 | 0 |
| 0.8194444444444445 | 0 |
| 0.8201388888888889 | 0 |
| 0.8208333333333333 | 0 |
| 0.8215277777777777 | 0 |
| 0.8222222222222223 | 0 |
| 0.8229166666666666 | 0 |
| 0.8236111111111111 | 0 |
| 0.8243055555555556 | 0 |
| 0.8250000000000001 | 0 |
| 0.8256944444444444 | 0 |
| 0.8263888888888888 | 0 |
| 0.8270833333333334 | 0 |
| 0.8277777777777778 | 0 |
| 0.8284722222222222 | 0 |
| 0.8291666666666666 | 0 |
| 0.8298611111111112 | 0 |
| 0.8305555555555556 | 0 |
| 0.8312499999999999 | 0 |
| 0.8319444444444444 | 0 |
| 0.8326388888888889 | 0 |
| 0.8333333333333334 | 0 |
| 0.8340277777777777 | 0 |
| 0.8347222222222223 | 0 |
| 0.8354166666666667 | 0 |
| 0.8361111111111111 | 0 |
| 0.8368055555555555 | 0 |
| 0.8375 | 0 |
| 0.8381944444444445 | 0 |
| 0.8388888888888889 | 0 |
| 0.8395833333333332 | 0 |
| 0.8402777777777778 | 0 |
| 0.8409722222222222 | 0 |
| 0.8416666666666667 | 0 |
| 0.842361111111111 | 0 |
| 0.8430555555555556 | 0 |
| 0.84375 | 0 |
| 0.8444444444444444 | 0 |
| 0.845138888888889 | 0 |
| 0.8458333333333333 | 0 |
| 0.8465277777777778 | 0 |
| 0.8472222222222222 | 0 |
| 0.8479166666666668 | 0 |
| 0.8486111111111111 | 0 |
| 0.8493055555555555 | 0 |
| 0.85 | 0 |
| 0.8506944444444445 | 0 |
| 0.8513888888888889 | 0 |
| 0.8520833333333333 | 0 |
| 0.8527777777777777 | 0 |
| 0.8534722222222223 | 0 |
| 0.8541666666666666 | 0 |
| 0.8548611111111111 | 0 |
| 0.8555555555555556 | 0 |
| 0.8562500000000001 | 0 |
| 0.8569444444444444 | 0 |
| 0.8576388888888888 | 0 |
| 0.8583333333333334 | 0 |
| 0.8590277777777778 | 0 |
| 0.8597222222222222 | 0 |
| 0.8604166666666666 | 0 |
| 0.8611111111111112 | 0 |
| 0.8618055555555556 | 0 |
| 0.8624999999999999 | 0 |
| 0.8631944444444444 | 0 |
| 0.8638888888888889 | 0 |
| 0.8645833333333334 | 0 |
| 0.8652777777777777 | 0 |
| 0.8659722222222223 | 0 |
| 0.8666666666666667 | 0 |
| 0.8673611111111111 | 0 |
| 0.8680555555555555 | 0 |
| 0.86875 | 0 |
| 0.8694444444444445 | 0 |
| 0.8701388888888889 | 0 |
| 0.8708333333333332 | 0 |
| 0.8715277777777778 | 0 |
| 0.8722222222222222 | 0 |
| 0.8729166666666667 | 0 |
| 0.873611111111111 | 0 |
| 0.8743055555555556 | 0 |
| 0.875 | 0 |
| 0.8756944444444444 | 0 |
| 0.876388888888889 | 0 |
| 0.8770833333333333 | 0 |
| 0.8777777777777778 | 0 |
| 0.8784722222222222 | 0 |
| 0.8791666666666668 | 0 |
| 0.8798611111111111 | 0 |
| 0.8805555555555555 | 0 |
| 0.88125 | 0 |
| 0.8819444444444445 | 0 |
| 0.8826388888888889 | 0 |
| 0.8833333333333333 | 0 |
| 0.8840277777777777 | 0 |
| 0.8847222222222223 | 0 |
| 0.8854166666666666 | 0 |
| 0.8861111111111111 | 0 |
| 0.8868055555555556 | 0 |
| 0.8875000000000001 | 0 |
| 0.8881944444444444 | 0 |
| 0.8888888888888888 | 0 |
| 0.8895833333333334 | 0 |
| 0.8902777777777778 | 0 |
| 0.8909722222222222 | 0 |
| 0.8916666666666666 | 0 |
| 0.8923611111111112 | 0 |
| 0.8930555555555556 | 0 |
| 0.8937499999999999 | 0 |
| 0.8944444444444444 | 0 |
| 0.8951388888888889 | 0 |
| 0.8958333333333334 | 0 |
| 0.8965277777777777 | 0 |
| 0.8972222222222223 | 0 |
| 0.8979166666666667 | 0 |
| 0.8986111111111111 | 0 |
| 0.8993055555555555 | 0 |
| 0.9 | 0 |
| 0.9006944444444445 | 0 |
| 0.9013888888888889 | 0 |
| 0.9020833333333332 | 0 |
| 0.9027777777777778 | 0 |
| 0.9034722222222222 | 0 |
| 0.9041666666666667 | 0 |
| 0.904861111111111 | 0 |
| 0.9055555555555556 | 0 |
| 0.90625 | 0 |
| 0.9069444444444444 | 0 |
| 0.907638888888889 | 0 |
| 0.9083333333333333 | 0 |
| 0.9090277777777778 | 0 |
| 0.9097222222222222 | 0 |
| 0.9104166666666668 | 0 |
| 0.9111111111111111 | 0 |
| 0.9118055555555555 | 0 |
| 0.9125 | 0 |
| 0.9131944444444445 | 0 |
| 0.9138888888888889 | 0 |
| 0.9145833333333333 | 0 |
| 0.9152777777777777 | 0 |
| 0.9159722222222223 | 0 |
| 0.9166666666666666 | 0 |
| 0.9173611111111111 | 0 |
| 0.9180555555555556 | 0 |
| 0.9187500000000001 | 0 |
| 0.9194444444444444 | 0 |
| 0.9201388888888888 | 0 |
| 0.9208333333333334 | 0 |
| 0.9215277777777778 | 0 |
| 0.9222222222222222 | 0 |
| 0.9229166666666666 | 0 |
| 0.9236111111111112 | 0 |
| 0.9243055555555556 | 0 |
| 0.9249999999999999 | 0 |
| 0.9256944444444444 | 0 |
| 0.9263888888888889 | 0 |
| 0.9270833333333334 | 0 |
| 0.9277777777777777 | 0 |
| 0.9284722222222223 | 0 |
| 0.9291666666666667 | 0 |
| 0.9298611111111111 | 0 |
| 0.9305555555555555 | 0 |
| 0.93125 | 0 |
| 0.9319444444444445 | 0 |
| 0.9326388888888889 | 0 |
| 0.9333333333333332 | 0 |
| 0.9340277777777778 | 0 |
| 0.9347222222222222 | 0 |
| 0.9354166666666667 | 0 |
| 0.936111111111111 | 0 |
| 0.9368055555555556 | 0 |
| 0.9375 | 0 |
| 0.9381944444444444 | 0 |
| 0.938888888888889 | 0 |
| 0.9395833333333333 | 0 |
| 0.9402777777777778 | 0 |
| 0.9409722222222222 | 0 |
| 0.9416666666666668 | 0 |
| 0.9423611111111111 | 0 |
| 0.9430555555555555 | 0 |
| 0.94375 | 0 |
| 0.9444444444444445 | 0 |
| 0.9451388888888889 | 0 |
| 0.9458333333333333 | 0 |
| 0.9465277777777777 | 0 |
| 0.9472222222222223 | 0 |
| 0.9479166666666666 | 0 |
| 0.9486111111111111 | 0 |
| 0.9493055555555556 | 0 |
| 0.9500000000000001 | 0 |
| 0.9506944444444444 | 0 |
| 0.9513888888888888 | 0 |
| 0.9520833333333334 | 0 |
| 0.9527777777777778 | 0 |
| 0.9534722222222222 | 0 |
| 0.9541666666666666 | 0 |
| 0.9548611111111112 | 0 |
| 0.9555555555555556 | 0 |
| 0.9562499999999999 | 0 |
| 0.9569444444444444 | 0 |
| 0.9576388888888889 | 0 |
| 0.9583333333333334 | 0 |
| 0.9590277777777777 | 0 |
| 0.9597222222222223 | 0 |
| 0.9604166666666667 | 0 |
| 0.9611111111111111 | 0 |
| 0.9618055555555555 | 0 |
| 0.9625 | 0 |
| 0.9631944444444445 | 0 |
| 0.9638888888888889 | 0 |
| 0.9645833333333332 | 0 |
| 0.9652777777777778 | 0 |
| 0.9659722222222222 | 0 |
| 0.9666666666666667 | 0 |
| 0.967361111111111 | 0 |
| 0.9680555555555556 | 0 |
| 0.96875 | 0 |
| 0.9694444444444444 | 0 |
| 0.970138888888889 | 0 |
| 0.9708333333333333 | 0 |
| 0.9715277777777778 | 0 |
| 0.9722222222222222 | 0 |
| 0.9729166666666668 | 0 |
| 0.9736111111111111 | 0 |
| 0.9743055555555555 | 0 |
| 0.975 | 0 |
| 0.9756944444444445 | 0 |
| 0.9763888888888889 | 0 |
| 0.9770833333333333 | 0 |
| 0.9777777777777777 | 0 |
| 0.9784722222222223 | 0 |
| 0.9791666666666666 | 0 |
| 0.9798611111111111 | 0 |
| 0.9805555555555556 | 0 |
| 0.9812500000000001 | 0 |
| 0.9819444444444444 | 0 |
| 0.9826388888888888 | 0 |
| 0.9833333333333334 | 0 |
| 0.9840277777777778 | 0 |
| 0.9847222222222222 | 0 |
| 0.9854166666666666 | 0 |
| 0.9861111111111112 | 0 |
| 0.9868055555555556 | 0 |
| 0.9874999999999999 | 0 |
| 0.9881944444444444 | 0 |
| 0.9888888888888889 | 0 |
| 0.9895833333333334 | 0 |
| 0.9902777777777777 | 0 |
| 0.9909722222222223 | 0 |
| 0.9916666666666667 | 0 |
| 0.9923611111111111 | 0 |
| 0.9930555555555555 | 0 |
| 0.99375 | 0 |
| 0.9944444444444445 | 0 |
| 0.9951388888888889 | 0 |
| 0.9958333333333332 | 0 |
| 0.9965277777777778 | 0 |
| 0.9972222222222222 | 0 |
| 0.9979166666666667 | 0 |
| 0.998611111111111 | 0 |
| 0.9993055555555556 | 0 |